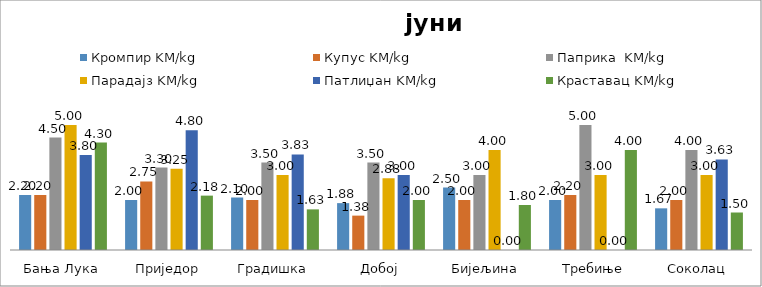
| Category | Кромпир | Купус | Паприка  | Парадајз | Патлиџан | Краставац |
|---|---|---|---|---|---|---|
| Бања Лука | 2.2 | 2.2 | 4.5 | 5 | 3.8 | 4.3 |
| Приједор | 2 | 2.745 | 3.3 | 3.25 | 4.795 | 2.175 |
| Градишка | 2.1 | 2 | 3.5 | 3 | 3.825 | 1.625 |
| Добој | 1.875 | 1.375 | 3.5 | 2.875 | 3 | 2 |
| Бијељина | 2.5 | 2 | 3 | 4 | 0 | 1.8 |
|  Требиње | 2 | 2.2 | 5 | 3 | 0 | 4 |
| Соколац | 1.667 | 2 | 4 | 3 | 3.625 | 1.5 |